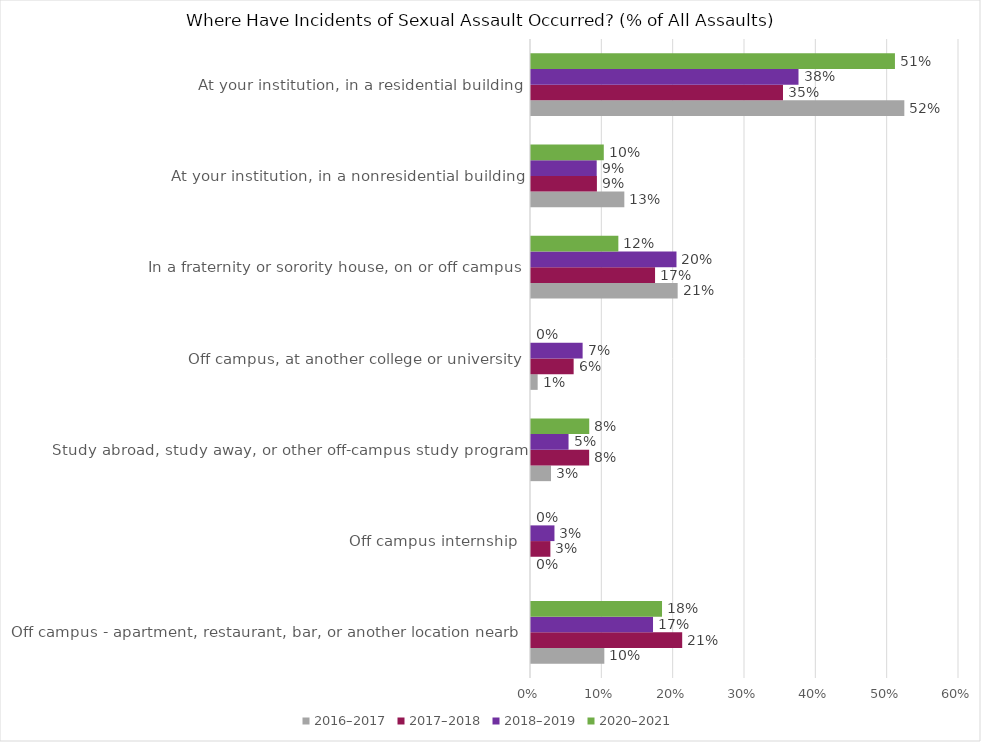
| Category | 2016–2017 | 2017–2018 | 2018–2019 | 2020–2021 |
|---|---|---|---|---|
| Off campus - apartment, restaurant, bar, or another location nearby | 0.103 | 0.212 | 0.171 | 0.184 |
| Off campus internship | 0 | 0.027 | 0.033 | 0 |
| Study abroad, study away, or other off-campus study program | 0.028 | 0.082 | 0.053 | 0.082 |
| Off campus, at another college or university | 0.009 | 0.06 | 0.072 | 0 |
| In a fraternity or sorority house, on or off campus | 0.206 | 0.174 | 0.204 | 0.122 |
| At your institution, in a nonresidential building | 0.131 | 0.092 | 0.092 | 0.102 |
| At your institution, in a residential building | 0.523 | 0.353 | 0.375 | 0.51 |